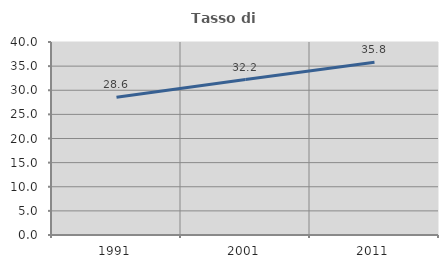
| Category | Tasso di occupazione   |
|---|---|
| 1991.0 | 28.555 |
| 2001.0 | 32.217 |
| 2011.0 | 35.787 |